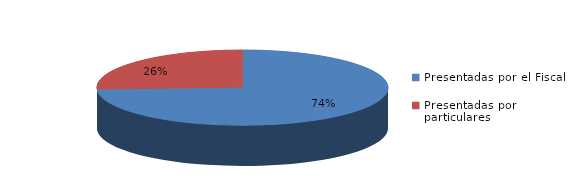
| Category | Series 0 |
|---|---|
| Presentadas por el Fiscal | 118 |
| Presentadas por particulares | 41 |